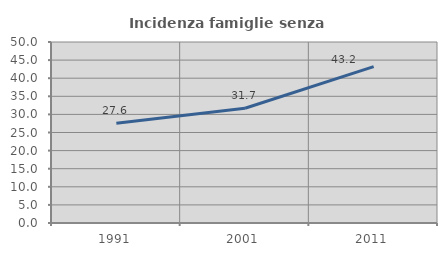
| Category | Incidenza famiglie senza nuclei |
|---|---|
| 1991.0 | 27.551 |
| 2001.0 | 31.69 |
| 2011.0 | 43.182 |